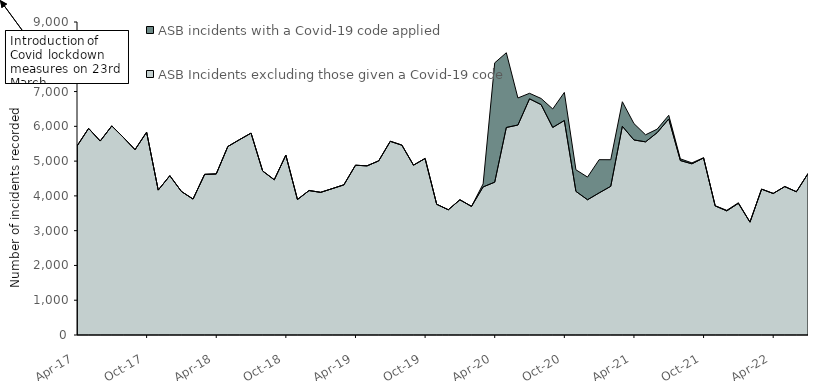
| Category | ASB Incidents excluding those given a Covid-19 code | ASB incidents with a Covid-19 code applied |
|---|---|---|
| 2017-04-01 | 5433 | 0 |
| 2017-05-01 | 5941 | 0 |
| 2017-06-01 | 5577 | 0 |
| 2017-07-01 | 6012 | 0 |
| 2017-08-01 | 5681 | 0 |
| 2017-09-01 | 5329 | 0 |
| 2017-10-01 | 5832 | 0 |
| 2017-11-01 | 4167 | 0 |
| 2017-12-01 | 4580 | 0 |
| 2018-01-01 | 4127 | 0 |
| 2018-02-01 | 3909 | 0 |
| 2018-03-01 | 4619 | 0 |
| 2018-04-01 | 4631 | 0 |
| 2018-05-01 | 5420 | 0 |
| 2018-06-01 | 5616 | 0 |
| 2018-07-01 | 5805 | 0 |
| 2018-08-01 | 4716 | 0 |
| 2018-09-01 | 4464 | 0 |
| 2018-10-01 | 5172 | 0 |
| 2018-11-01 | 3896 | 0 |
| 2018-12-01 | 4154 | 0 |
| 2019-01-01 | 4102 | 0 |
| 2019-02-01 | 4209 | 0 |
| 2019-03-01 | 4318 | 0 |
| 2019-04-01 | 4881 | 0 |
| 2019-05-01 | 4864 | 0 |
| 2019-06-01 | 5007 | 0 |
| 2019-07-01 | 5570 | 0 |
| 2019-08-01 | 5459 | 0 |
| 2019-09-01 | 4884 | 0 |
| 2019-10-01 | 5076 | 0 |
| 2019-11-01 | 3759 | 0 |
| 2019-12-01 | 3601 | 0 |
| 2020-01-01 | 3888 | 0 |
| 2020-02-01 | 3698 | 0 |
| 2020-03-01 | 4258 | 86 |
| 2020-04-01 | 4394 | 3431 |
| 2020-05-01 | 5967 | 2149 |
| 2020-06-01 | 6037 | 779 |
| 2020-07-01 | 6791 | 159 |
| 2020-08-01 | 6624 | 177 |
| 2020-09-01 | 5968 | 532 |
| 2020-10-01 | 6167 | 808 |
| 2020-11-01 | 4130 | 621 |
| 2020-12-01 | 3889 | 652 |
| 2021-01-01 | 4086 | 955 |
| 2021-02-01 | 4275 | 765 |
| 2021-03-01 | 6001 | 706 |
| 2021-04-01 | 5608 | 471 |
| 2021-05-01 | 5554 | 203 |
| 2021-06-01 | 5818 | 102 |
| 2021-07-01 | 6211 | 107 |
| 2021-08-01 | 5016 | 49 |
| 2021-09-01 | 4922 | 27 |
| 2021-10-01 | 5090 | 9 |
| 2021-11-01 | 3712 | 5 |
| 2021-12-01 | 3569 | 16 |
| 2022-01-01 | 3786 | 16 |
| 2022-02-01 | 3245 | 1 |
| 2022-03-01 | 4194 | 1 |
| 2022-04-01 | 4070 | 0 |
| 2022-05-01 | 4268 | 0 |
| 2022-06-01 | 4119 | 0 |
| 2022-07-01 | 4641 | 0 |